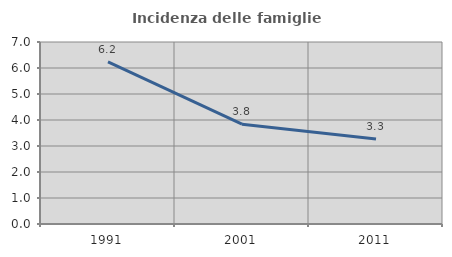
| Category | Incidenza delle famiglie numerose |
|---|---|
| 1991.0 | 6.235 |
| 2001.0 | 3.838 |
| 2011.0 | 3.27 |